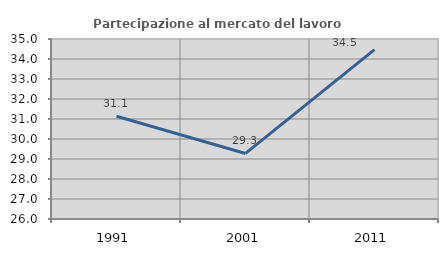
| Category | Partecipazione al mercato del lavoro  femminile |
|---|---|
| 1991.0 | 31.134 |
| 2001.0 | 29.277 |
| 2011.0 | 34.466 |